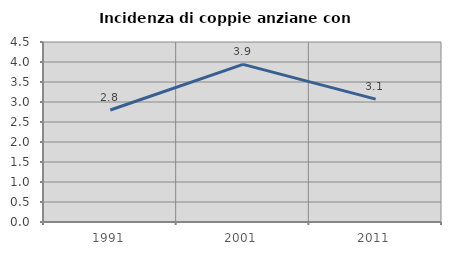
| Category | Incidenza di coppie anziane con figli |
|---|---|
| 1991.0 | 2.8 |
| 2001.0 | 3.94 |
| 2011.0 | 3.072 |